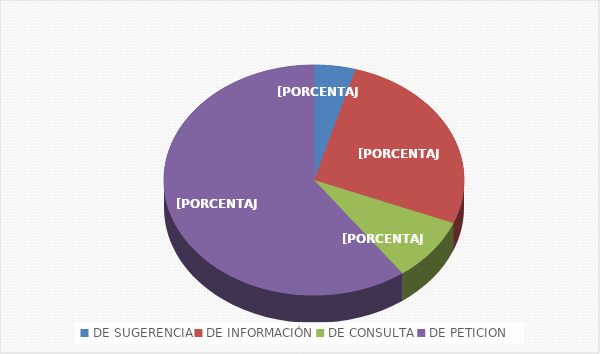
| Category | Series 0 |
|---|---|
| DE SUGERENCIA | 2 |
| DE INFORMACIÓN | 12 |
| DE CONSULTA | 4 |
| DE PETICION | 27 |